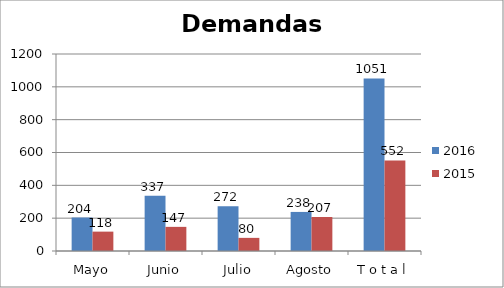
| Category | 2016 | 2015 |
|---|---|---|
| Mayo | 204 | 118 |
| Junio | 337 | 147 |
| Julio | 272 | 80 |
| Agosto | 238 | 207 |
| T o t a l | 1051 | 552 |